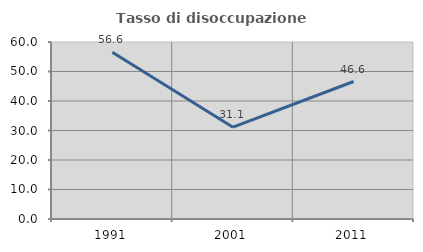
| Category | Tasso di disoccupazione giovanile  |
|---|---|
| 1991.0 | 56.557 |
| 2001.0 | 31.111 |
| 2011.0 | 46.61 |